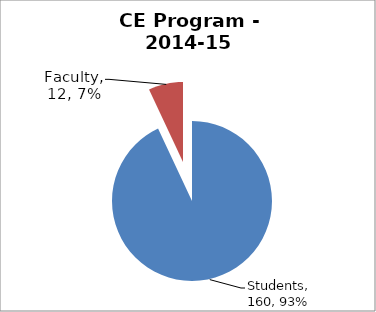
| Category | Series 0 |
|---|---|
| Students | 160 |
| Faculty | 12 |